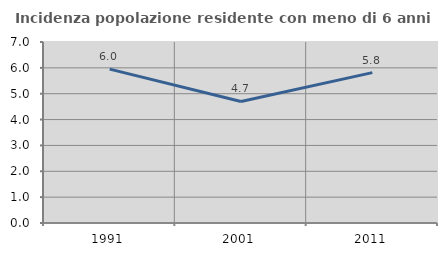
| Category | Incidenza popolazione residente con meno di 6 anni |
|---|---|
| 1991.0 | 5.952 |
| 2001.0 | 4.699 |
| 2011.0 | 5.816 |